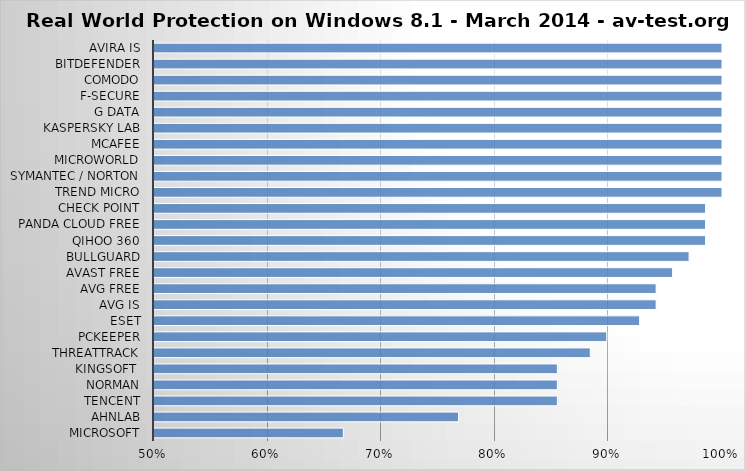
| Category | Series 0 |
|---|---|
| Microsoft | 0.667 |
| AhnLab | 0.768 |
| Tencent | 0.855 |
| Norman | 0.855 |
| Kingsoft  | 0.855 |
| ThreatTrack | 0.884 |
| PCKeeper | 0.899 |
| ESET | 0.928 |
| AVG IS | 0.942 |
| AVG Free | 0.942 |
| Avast Free | 0.957 |
| BullGuard | 0.971 |
| Qihoo 360 | 0.986 |
| Panda Cloud Free | 0.986 |
| Check Point | 0.986 |
| Trend Micro | 1 |
| Symantec / Norton | 1 |
| Microworld | 1 |
| McAfee | 1 |
| Kaspersky Lab | 1 |
| G Data | 1 |
| F-Secure | 1 |
| Comodo | 1 |
| Bitdefender | 1 |
| Avira IS | 1 |